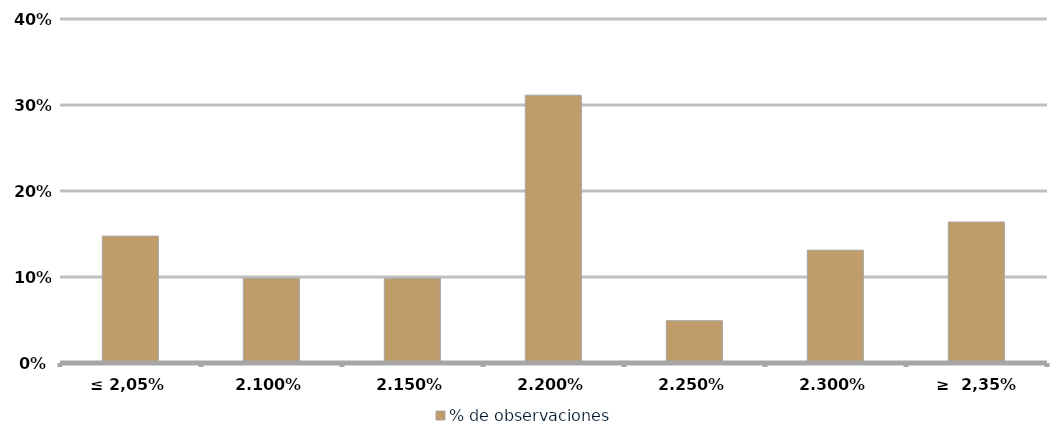
| Category | % de observaciones  |
|---|---|
| ≤ 2,05% | 0.148 |
| 2.10% | 0.098 |
| 2.15% | 0.098 |
| 2.20% | 0.311 |
| 2.25% | 0.049 |
| 2.30% | 0.131 |
| ≥  2,35% | 0.164 |